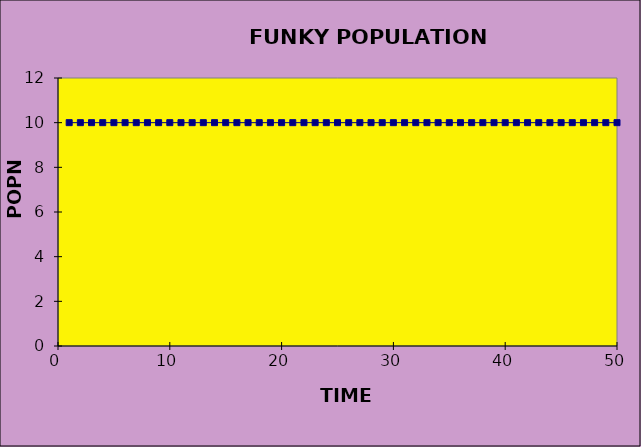
| Category | Series 0 |
|---|---|
| 1.0 | 10 |
| 2.0 | 10 |
| 3.0 | 10 |
| 4.0 | 10 |
| 5.0 | 10 |
| 6.0 | 10 |
| 7.0 | 10 |
| 8.0 | 10 |
| 9.0 | 10 |
| 10.0 | 10 |
| 11.0 | 10 |
| 12.0 | 10 |
| 13.0 | 10 |
| 14.0 | 10 |
| 15.0 | 10 |
| 16.0 | 10 |
| 17.0 | 10 |
| 18.0 | 10 |
| 19.0 | 10 |
| 20.0 | 10 |
| 21.0 | 10 |
| 22.0 | 10 |
| 23.0 | 10 |
| 24.0 | 10 |
| 25.0 | 10 |
| 26.0 | 10 |
| 27.0 | 10 |
| 28.0 | 10 |
| 29.0 | 10 |
| 30.0 | 10 |
| 31.0 | 10 |
| 32.0 | 10 |
| 33.0 | 10 |
| 34.0 | 10 |
| 35.0 | 10 |
| 36.0 | 10 |
| 37.0 | 10 |
| 38.0 | 10 |
| 39.0 | 10 |
| 40.0 | 10 |
| 41.0 | 10 |
| 42.0 | 10 |
| 43.0 | 10 |
| 44.0 | 10 |
| 45.0 | 10 |
| 46.0 | 10 |
| 47.0 | 10 |
| 48.0 | 10 |
| 49.0 | 10 |
| 50.0 | 10 |